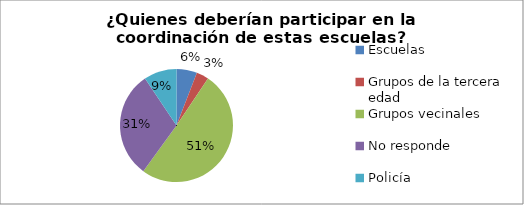
| Category | Series 0 |
|---|---|
| Escuelas | 0.059 |
| Grupos de la tercera edad | 0.035 |
| Grupos vecinales | 0.506 |
| No responde | 0.306 |
| Policía | 0.094 |